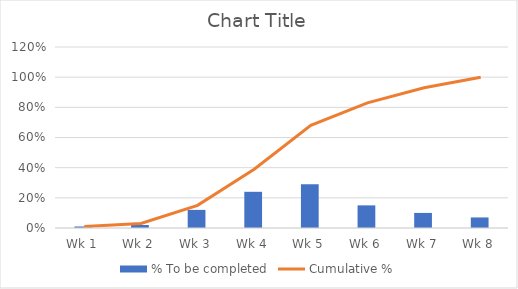
| Category | % To be completed |
|---|---|
| Wk 1 | 0.01 |
| Wk 2 | 0.02 |
| Wk 3 | 0.12 |
| Wk 4 | 0.24 |
| Wk 5 | 0.29 |
| Wk 6 | 0.15 |
| Wk 7 | 0.1 |
| Wk 8 | 0.07 |